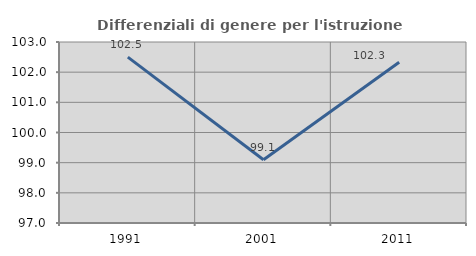
| Category | Differenziali di genere per l'istruzione superiore |
|---|---|
| 1991.0 | 102.497 |
| 2001.0 | 99.098 |
| 2011.0 | 102.331 |